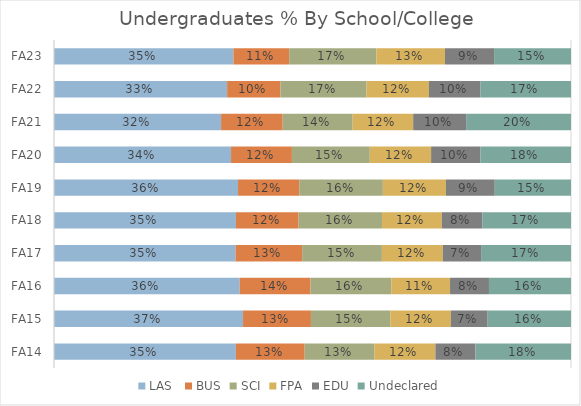
| Category | LAS  | BUS | SCI | FPA | EDU | Undeclared |
|---|---|---|---|---|---|---|
| FA14 | 0.352 | 0.133 | 0.135 | 0.118 | 0.078 | 0.185 |
| FA15 | 0.366 | 0.131 | 0.154 | 0.117 | 0.071 | 0.161 |
| FA16 | 0.359 | 0.137 | 0.156 | 0.114 | 0.075 | 0.159 |
| FA17 | 0.351 | 0.129 | 0.154 | 0.118 | 0.074 | 0.174 |
| FA18 | 0.352 | 0.121 | 0.161 | 0.116 | 0.079 | 0.171 |
| FA19 | 0.356 | 0.118 | 0.162 | 0.122 | 0.094 | 0.147 |
| FA20 | 0.342 | 0.118 | 0.151 | 0.119 | 0.096 | 0.175 |
| FA21 | 0.323 | 0.119 | 0.135 | 0.117 | 0.102 | 0.203 |
| FA22 | 0.335 | 0.103 | 0.166 | 0.121 | 0.1 | 0.175 |
| FA23 | 0.347 | 0.108 | 0.169 | 0.133 | 0.095 | 0.149 |